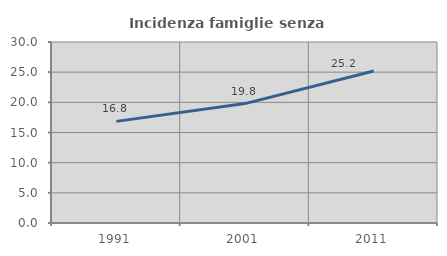
| Category | Incidenza famiglie senza nuclei |
|---|---|
| 1991.0 | 16.842 |
| 2001.0 | 19.792 |
| 2011.0 | 25.196 |